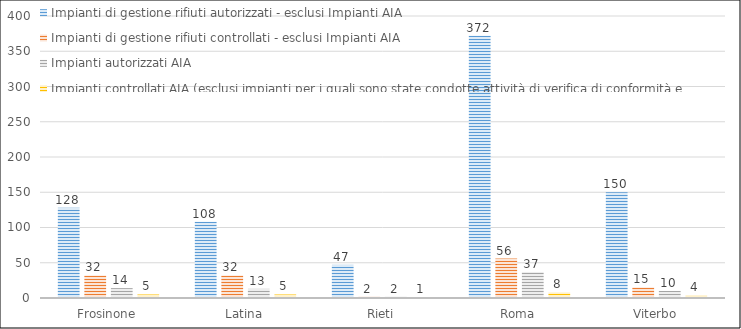
| Category | Impianti di gestione rifiuti autorizzati - esclusi Impianti AIA | Impianti di gestione rifiuti controllati - esclusi Impianti AIA | Impianti autorizzati AIA | Impianti controllati AIA (esclusi impianti per i quali sono state condotte attività di verifica di conformità e verifica d'ufficio) |
|---|---|---|---|---|
| Frosinone | 128 | 32 | 14 | 5 |
| Latina | 108 | 32 | 13 | 5 |
| Rieti | 47 | 2 | 2 | 1 |
| Roma | 372 | 56 | 37 | 8 |
| Viterbo | 150 | 15 | 10 | 4 |